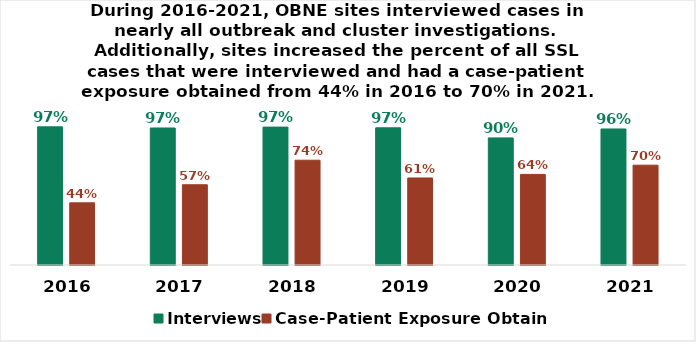
| Category | Interviews | Case-Patient Exposure Obtained |
|---|---|---|
| 2016.0 | 97.3 | 43.78 |
| 2017.0 | 96.5 | 56.507 |
| 2018.0 | 97.1 | 73.8 |
| 2019.0 | 96.6 | 61.3 |
| 2020.0 | 89.5 | 63.8 |
| 2021.0 | 95.8 | 70.3 |